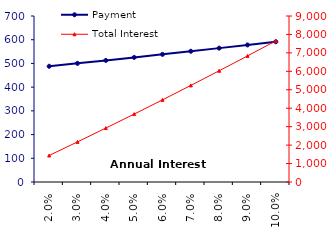
| Category | Payment |
|---|---|
| 0.02 | 487.99 |
| 0.03 | 500.27 |
| 0.04 | 512.73 |
| 0.05 | 525.39 |
| 0.06 | 538.24 |
| 0.07 | 551.29 |
| 0.08 | 564.52 |
| 0.09 | 577.93 |
| 0.1 | 591.54 |